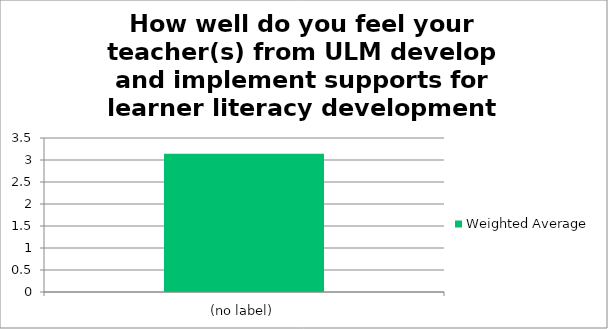
| Category | Weighted Average |
|---|---|
| (no label) | 3.14 |